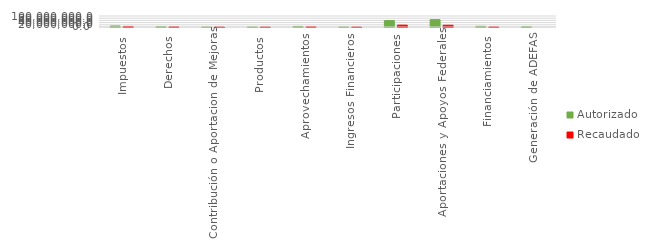
| Category | Autorizado | Recaudado |
|---|---|---|
| Impuestos | 9314383 | 5034806.5 |
| Derechos | 2568365 | 1102902.1 |
| Contribución o Aportacion de Mejoras | 164609 | 60029.1 |
| Productos | 246094 | 91564.8 |
| Aprovechamientos | 5092127.3 | 1492762.1 |
| Ingresos Financieros | 250000 | 96547.5 |
| Participaciones | 58073903 | 16717142.4 |
| Aportaciones y Apoyos Federales | 66633413 | 15815189 |
| Financiamientos | 6000000 | 653992.4 |
| Generación de ADEFAS | 2460661 | 0 |